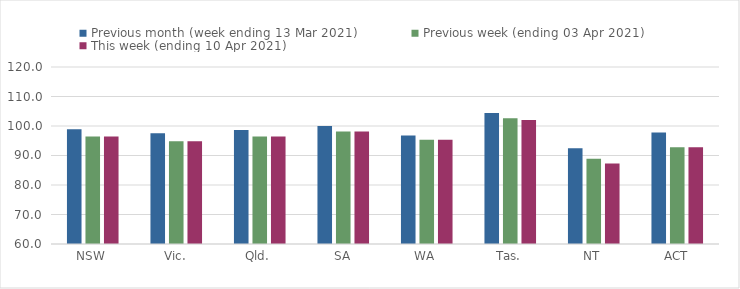
| Category | Previous month (week ending 13 Mar 2021) | Previous week (ending 03 Apr 2021) | This week (ending 10 Apr 2021) |
|---|---|---|---|
| NSW | 98.86 | 96.43 | 96.43 |
| Vic. | 97.53 | 94.83 | 94.83 |
| Qld. | 98.63 | 96.44 | 96.44 |
| SA | 100.02 | 98.14 | 98.14 |
| WA | 96.77 | 95.38 | 95.38 |
| Tas. | 104.39 | 102.63 | 102.06 |
| NT | 92.43 | 88.88 | 87.27 |
| ACT | 97.83 | 92.78 | 92.78 |